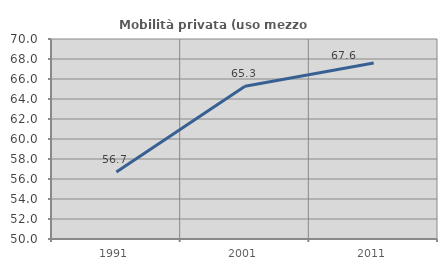
| Category | Mobilità privata (uso mezzo privato) |
|---|---|
| 1991.0 | 56.693 |
| 2001.0 | 65.279 |
| 2011.0 | 67.602 |